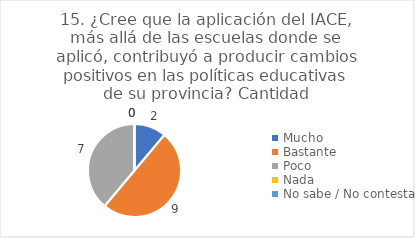
| Category | 15. ¿Cree que la aplicación del IACE, más allá de las escuelas donde se aplicó, contribuyó a producir cambios positivos en las políticas educativas de su provincia? |
|---|---|
| Mucho  | 0.111 |
| Bastante  | 0.5 |
| Poco  | 0.389 |
| Nada  | 0 |
| No sabe / No contesta | 0 |